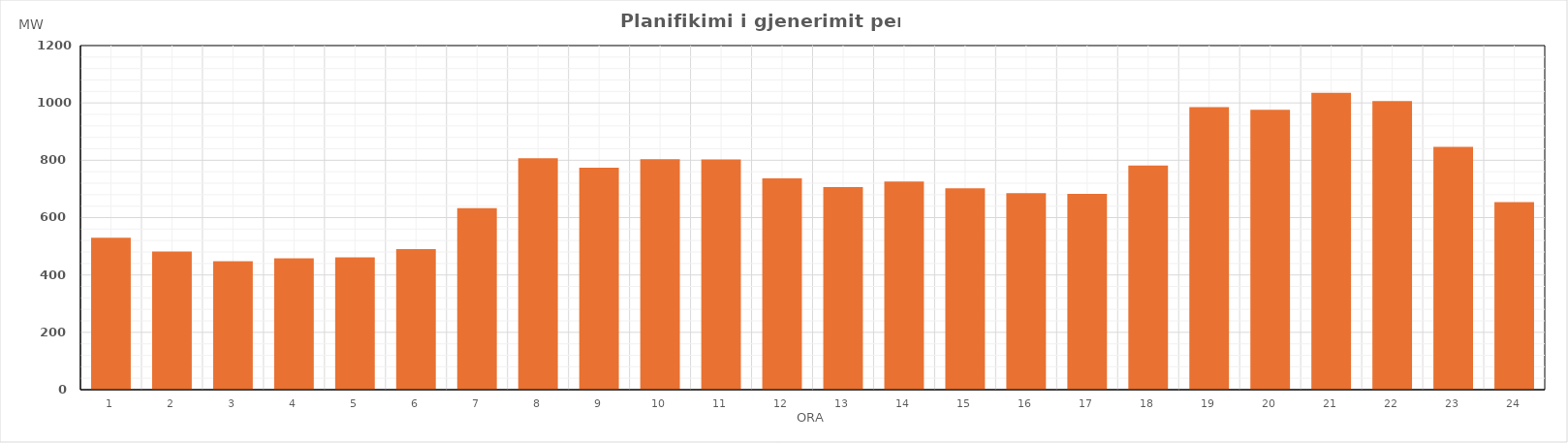
| Category | Max (MW) |
|---|---|
| 0 | 530.23 |
| 1 | 481.75 |
| 2 | 448.13 |
| 3 | 458.34 |
| 4 | 461.55 |
| 5 | 490.14 |
| 6 | 632.75 |
| 7 | 806.62 |
| 8 | 774.15 |
| 9 | 803.85 |
| 10 | 802.54 |
| 11 | 736.64 |
| 12 | 706.26 |
| 13 | 725.59 |
| 14 | 701.85 |
| 15 | 685.24 |
| 16 | 682.77 |
| 17 | 781.42 |
| 18 | 985.34 |
| 19 | 976.04 |
| 20 | 1035.36 |
| 21 | 1006.57 |
| 22 | 847.11 |
| 23 | 653.94 |